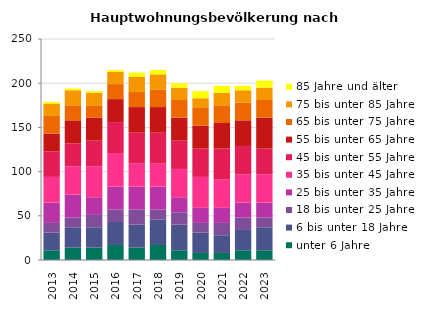
| Category | unter 6 Jahre | 6 bis unter 18 Jahre | 18 bis unter 25 Jahre | 25 bis unter 35 Jahre | 35 bis unter 45 Jahre | 45 bis unter 55 Jahre | 55 bis unter 65 Jahre | 65 bis unter 75 Jahre | 75 bis unter 85 Jahre | 85 Jahre und älter |
|---|---|---|---|---|---|---|---|---|---|---|
| 2013.0 | 11 | 20 | 11 | 23 | 29 | 29 | 20 | 20 | 14 | 2 |
| 2014.0 | 14 | 23 | 11 | 26 | 32 | 26 | 26 | 17 | 17 | 2 |
| 2015.0 | 14 | 23 | 14 | 20 | 35 | 29 | 26 | 14 | 14 | 2 |
| 2016.0 | 17 | 26 | 14 | 26 | 38 | 35 | 26 | 17 | 14 | 2 |
| 2017.0 | 14 | 26 | 17 | 26 | 26 | 35 | 29 | 17 | 17 | 5 |
| 2018.0 | 17 | 29 | 11 | 26 | 26 | 35 | 29 | 20 | 17 | 5 |
| 2019.0 | 11 | 29 | 14 | 17 | 32 | 32 | 26 | 20 | 14 | 5 |
| 2020.0 | 8 | 23 | 11 | 17 | 35 | 32 | 26 | 20 | 11 | 8 |
| 2021.0 | 8 | 20 | 14 | 17 | 32 | 35 | 29 | 20 | 14 | 8 |
| 2022.0 | 11 | 23 | 14 | 17 | 32 | 32 | 29 | 20 | 14 | 5 |
| 2023.0 | 11 | 26 | 11 | 17 | 32 | 29 | 35 | 20 | 14 | 8 |